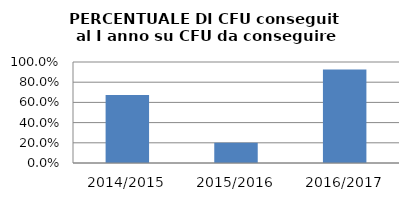
| Category | 2014/2015 2015/2016 2016/2017 |
|---|---|
| 2014/2015 | 0.674 |
| 2015/2016 | 0.2 |
| 2016/2017 | 0.925 |